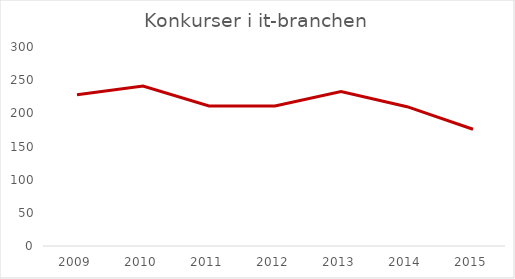
| Category | Konkurser i it-branchen |
|---|---|
| 2009.0 | 228 |
| 2010.0 | 241 |
| 2011.0 | 211 |
| 2012.0 | 211 |
| 2013.0 | 233 |
| 2014.0 | 210 |
| 2015.0 | 176 |